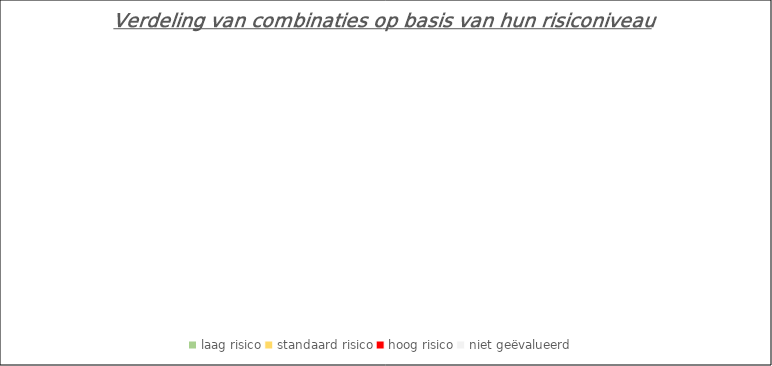
| Category | Reeks 1 |
|---|---|
| laag risico | 0 |
| standaard risico | 0 |
| hoog risico | 0 |
| niet geëvalueerd | 0 |